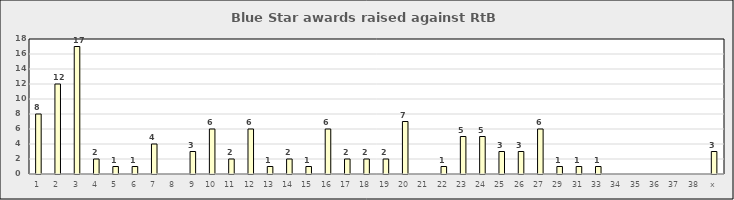
| Category | RtB Ref No. |
|---|---|
| 1 | 8 |
| 2 | 12 |
| 3 | 17 |
| 4 | 2 |
| 5 | 1 |
| 6 | 1 |
| 7 | 4 |
| 8 | 0 |
| 9 | 3 |
| 10 | 6 |
| 11 | 2 |
| 12 | 6 |
| 13 | 1 |
| 14 | 2 |
| 15 | 1 |
| 16 | 6 |
| 17 | 2 |
| 18 | 2 |
| 19 | 2 |
| 20 | 7 |
| 21 | 0 |
| 22 | 1 |
| 23 | 5 |
| 24 | 5 |
| 25 | 3 |
| 26 | 3 |
| 27 | 6 |
| 29 | 1 |
| 31 | 1 |
| 33 | 1 |
| 34 | 0 |
| 35 | 0 |
| 36 | 0 |
| 37 | 0 |
| 38 | 0 |
| x | 3 |